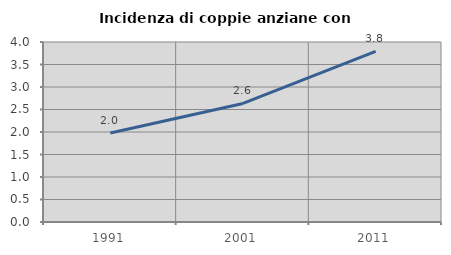
| Category | Incidenza di coppie anziane con figli |
|---|---|
| 1991.0 | 1.977 |
| 2001.0 | 2.634 |
| 2011.0 | 3.793 |